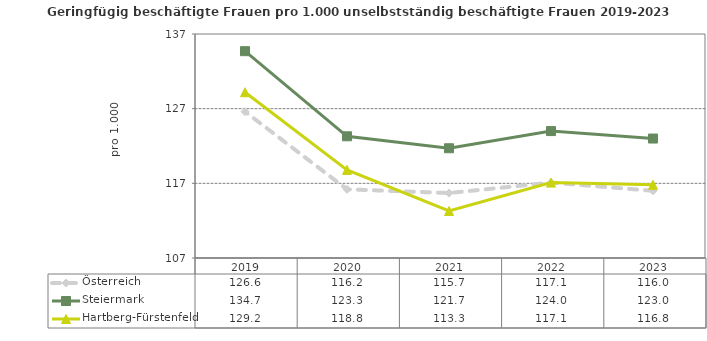
| Category | Österreich | Steiermark | Hartberg-Fürstenfeld |
|---|---|---|---|
| 2023.0 | 116 | 123 | 116.8 |
| 2022.0 | 117.1 | 124 | 117.1 |
| 2021.0 | 115.7 | 121.7 | 113.3 |
| 2020.0 | 116.2 | 123.3 | 118.8 |
| 2019.0 | 126.6 | 134.7 | 129.2 |